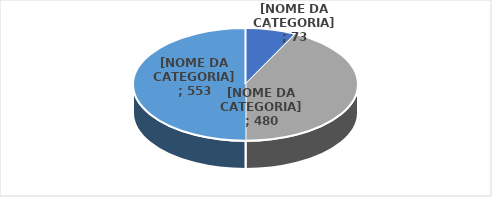
| Category | Series 0 |
|---|---|
| Clínica médica | 75 |
| Clinica cirúrgica | 435 |
| Total | 510 |